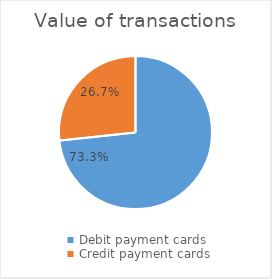
| Category | Value of transactions |
|---|---|
| Debit payment cards | 59742390772 |
| Credit payment cards | 21752518845 |